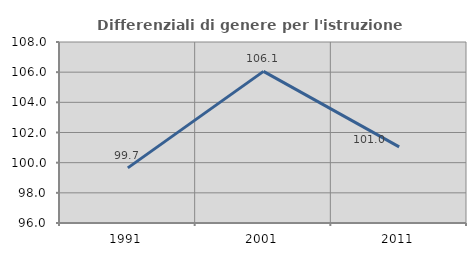
| Category | Differenziali di genere per l'istruzione superiore |
|---|---|
| 1991.0 | 99.654 |
| 2001.0 | 106.053 |
| 2011.0 | 101.046 |